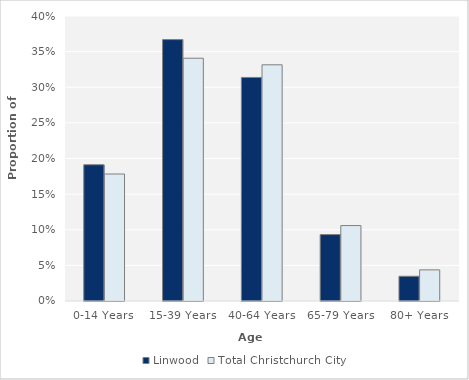
| Category | Linwood | Total Christchurch City |
|---|---|---|
| 0-14 Years | 0.191 | 0.178 |
| 15-39 Years | 0.367 | 0.341 |
| 40-64 Years | 0.314 | 0.331 |
| 65-79 Years | 0.093 | 0.106 |
| 80+ Years | 0.035 | 0.044 |